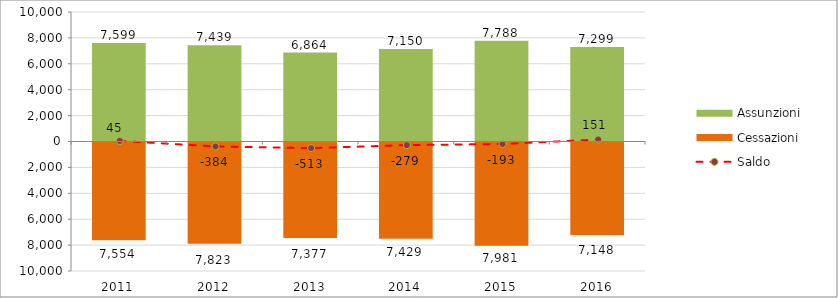
| Category | Assunzioni | Cessazioni |
|---|---|---|
| 2011.0 | 7599 | -7554 |
| 2012.0 | 7439 | -7823 |
| 2013.0 | 6864 | -7377 |
| 2014.0 | 7150 | -7429 |
| 2015.0 | 7788 | -7981 |
| 2016.0 | 7299 | -7148 |